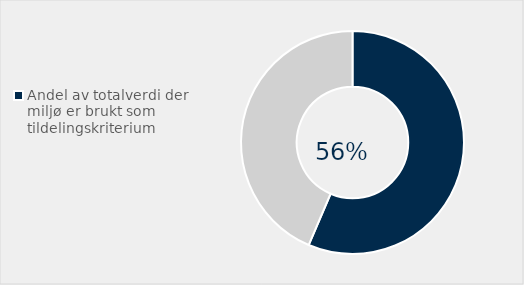
| Category | Series 0 |
|---|---|
| Andel av totalverdi der miljø er brukt som tildelingskriterium | 0.564 |
| Ikke brukt miljø miljø som tildelingskritierum | 0.436 |